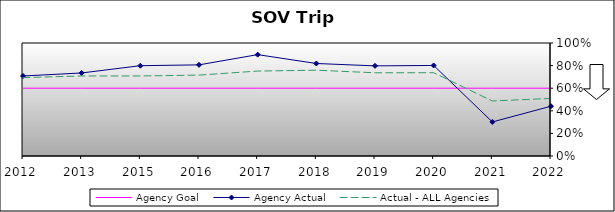
| Category | Agency Goal | Agency Actual | Actual - ALL Agencies |
|---|---|---|---|
| 2012.0 | 0.6 | 0.708 | 0.694 |
| 2013.0 | 0.6 | 0.735 | 0.708 |
| 2015.0 | 0.6 | 0.799 | 0.708 |
| 2016.0 | 0.6 | 0.806 | 0.716 |
| 2017.0 | 0.6 | 0.897 | 0.752 |
| 2018.0 | 0.6 | 0.819 | 0.759 |
| 2019.0 | 0.6 | 0.798 | 0.736 |
| 2020.0 | 0.6 | 0.801 | 0.737 |
| 2021.0 | 0.6 | 0.301 | 0.487 |
| 2022.0 | 0.6 | 0.44 | 0.509 |